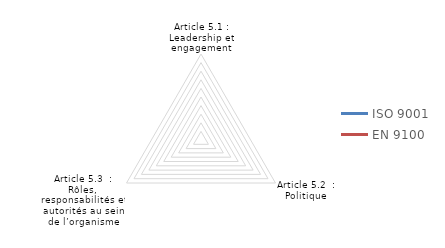
| Category | ISO 9001 | EN 9100 |
|---|---|---|
| Article 5.1 : Leadership et engagement | 0 | 0 |
| Article 5.2  : Politique | 0 | 0 |
| Article 5.3  : Rôles, responsabilités et autorités au sein de l’organisme | 0 | 0 |